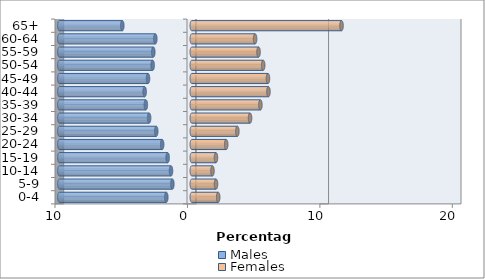
| Category | Males | Females |
|---|---|---|
| 0-4 | -1.923 | 1.994 |
| 5-9 | -1.465 | 1.83 |
| 10-14 | -1.568 | 1.562 |
| 15-19 | -1.822 | 1.826 |
| 20-24 | -2.236 | 2.597 |
| 25-29 | -2.684 | 3.441 |
| 30-34 | -3.22 | 4.4 |
| 35-39 | -3.469 | 5.181 |
| 40-44 | -3.558 | 5.788 |
| 45-49 | -3.305 | 5.753 |
| 50-54 | -2.954 | 5.392 |
| 55-59 | -2.905 | 5.041 |
| 60-64 | -2.753 | 4.78 |
| 65+ | -5.246 | 11.308 |